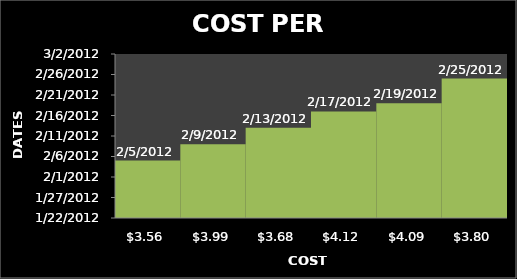
| Category | Series 0 |
|---|---|
| 3.56 | 2/5/12 |
| 3.99 | 2/9/12 |
| 3.68 | 2/13/12 |
| 4.12 | 2/17/12 |
| 4.09 | 2/19/12 |
| 3.8 | 2/25/12 |